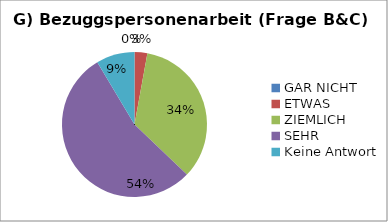
| Category | Series 0 |
|---|---|
| GAR NICHT | 0 |
| ETWAS | 2 |
| ZIEMLICH | 24 |
| SEHR | 38 |
| Keine Antwort | 6 |